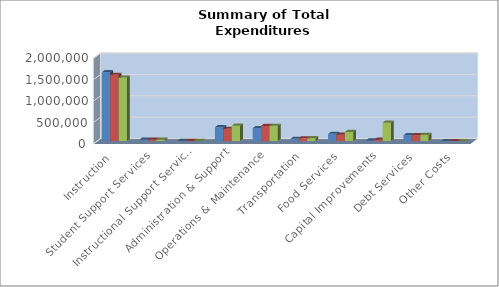
| Category | 2014-2015 | 2015-2016 | 2016-2017 |
|---|---|---|---|
| Instruction | 1608767 | 1547940 | 1483890 |
| Student Support Services | 33268 | 34386 | 34575 |
| Instructional Support Services | 1543 | 2362 | 2385 |
| Administration & Support | 322606 | 286071 | 359115 |
| Operations & Maintenance | 300948 | 355382 | 356471 |
| Transportation | 51727 | 65153 | 66500 |
| Food Services | 168971 | 149011 | 213250 |
| Capital Improvements | 12889 | 30484 | 430500 |
| Debt Services | 137458 | 139758 | 141858 |
| Other Costs | 0 | 922 | 0 |